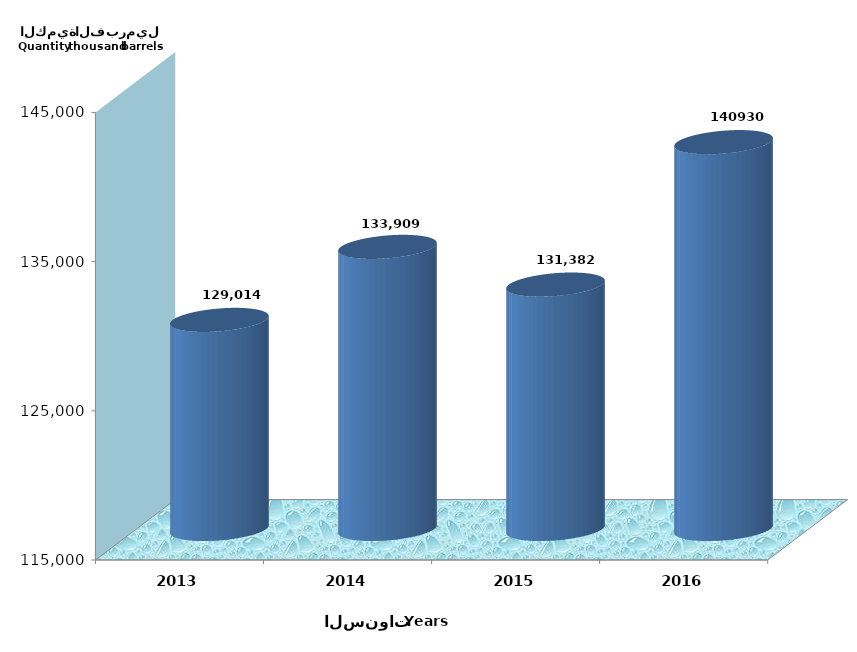
| Category | Series 0 |
|---|---|
| 2013 | 129014407 |
| 2014 | 133909387 |
| 2015 | 131382069 |
| 2016 | 140930326 |